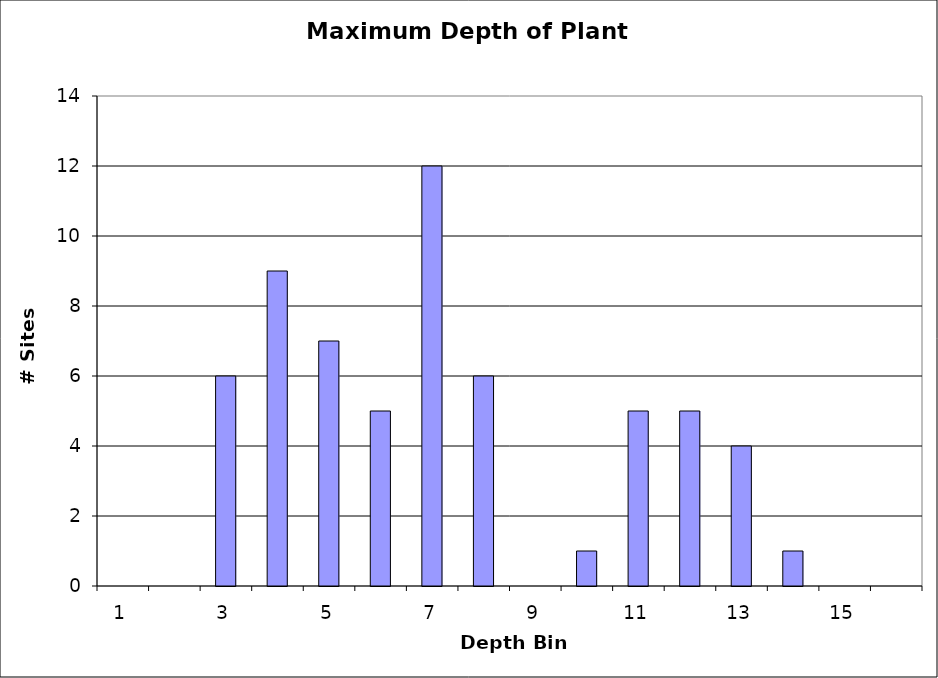
| Category | Series 0 |
|---|---|
| 1.0 | 0 |
| 2.0 | 0 |
| 3.0 | 6 |
| 4.0 | 9 |
| 5.0 | 7 |
| 6.0 | 5 |
| 7.0 | 12 |
| 8.0 | 6 |
| 9.0 | 0 |
| 10.0 | 1 |
| 11.0 | 5 |
| 12.0 | 5 |
| 13.0 | 4 |
| 14.0 | 1 |
| 15.0 | 0 |
| 16.0 | 0 |